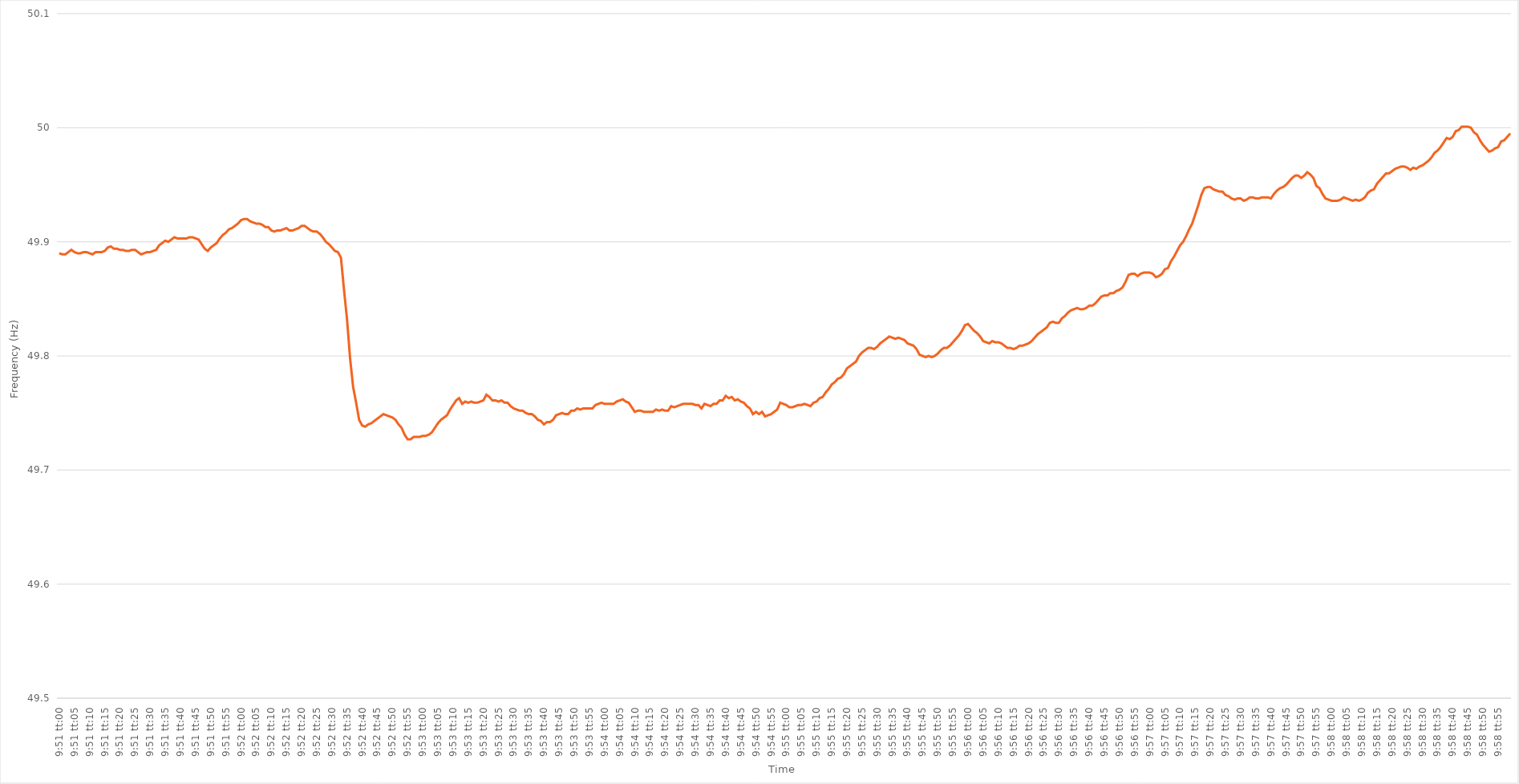
| Category | Series 0 |
|---|---|
| 0.41041666666666665 | 49.89 |
| 0.41042824074074075 | 49.889 |
| 0.4104398148148148 | 49.889 |
| 0.41045138888888894 | 49.891 |
| 0.410462962962963 | 49.893 |
| 0.41047453703703707 | 49.891 |
| 0.4104861111111111 | 49.89 |
| 0.4104976851851852 | 49.89 |
| 0.41050925925925924 | 49.891 |
| 0.4105208333333333 | 49.891 |
| 0.41053240740740743 | 49.89 |
| 0.41054398148148147 | 49.889 |
| 0.41055555555555556 | 49.891 |
| 0.4105671296296296 | 49.891 |
| 0.4105787037037037 | 49.891 |
| 0.41059027777777773 | 49.892 |
| 0.4106018518518519 | 49.895 |
| 0.4106134259259259 | 49.896 |
| 0.410625 | 49.894 |
| 0.41063657407407406 | 49.894 |
| 0.41064814814814815 | 49.893 |
| 0.4106597222222222 | 49.893 |
| 0.41067129629629634 | 49.892 |
| 0.4106828703703704 | 49.892 |
| 0.4106944444444445 | 49.893 |
| 0.4107060185185185 | 49.893 |
| 0.4107175925925926 | 49.891 |
| 0.41072916666666665 | 49.889 |
| 0.4107407407407408 | 49.89 |
| 0.41075231481481483 | 49.891 |
| 0.4107638888888889 | 49.891 |
| 0.41077546296296297 | 49.892 |
| 0.410787037037037 | 49.893 |
| 0.4107986111111111 | 49.897 |
| 0.41081018518518514 | 49.899 |
| 0.4108217592592593 | 49.901 |
| 0.41083333333333333 | 49.9 |
| 0.4108449074074074 | 49.902 |
| 0.41085648148148146 | 49.904 |
| 0.41086805555555556 | 49.903 |
| 0.4108796296296296 | 49.903 |
| 0.41089120370370374 | 49.903 |
| 0.4109027777777778 | 49.903 |
| 0.4109143518518519 | 49.904 |
| 0.4109259259259259 | 49.904 |
| 0.4109375 | 49.903 |
| 0.41094907407407405 | 49.902 |
| 0.4109606481481482 | 49.898 |
| 0.41097222222222224 | 49.894 |
| 0.41098379629629633 | 49.892 |
| 0.41099537037037037 | 49.895 |
| 0.4110069444444444 | 49.897 |
| 0.4110185185185185 | 49.899 |
| 0.41103009259259254 | 49.903 |
| 0.4110416666666667 | 49.906 |
| 0.41105324074074073 | 49.908 |
| 0.4110648148148148 | 49.911 |
| 0.41107638888888887 | 49.912 |
| 0.41108796296296296 | 49.914 |
| 0.411099537037037 | 49.916 |
| 0.41111111111111115 | 49.919 |
| 0.4111226851851852 | 49.92 |
| 0.4111342592592593 | 49.92 |
| 0.4111458333333333 | 49.918 |
| 0.4111574074074074 | 49.917 |
| 0.41116898148148145 | 49.916 |
| 0.4111805555555556 | 49.916 |
| 0.41119212962962964 | 49.915 |
| 0.41120370370370374 | 49.913 |
| 0.4112152777777778 | 49.913 |
| 0.4112268518518518 | 49.91 |
| 0.4112384259259259 | 49.909 |
| 0.41124999999999995 | 49.91 |
| 0.4112615740740741 | 49.91 |
| 0.41127314814814814 | 49.911 |
| 0.41128472222222223 | 49.912 |
| 0.41129629629629627 | 49.91 |
| 0.41130787037037037 | 49.91 |
| 0.4113194444444444 | 49.911 |
| 0.41133101851851855 | 49.912 |
| 0.4113425925925926 | 49.914 |
| 0.4113541666666667 | 49.914 |
| 0.4113657407407407 | 49.912 |
| 0.4113773148148148 | 49.91 |
| 0.41138888888888886 | 49.909 |
| 0.411400462962963 | 49.909 |
| 0.41141203703703705 | 49.907 |
| 0.41142361111111114 | 49.904 |
| 0.4114351851851852 | 49.9 |
| 0.4114467592592593 | 49.898 |
| 0.4114583333333333 | 49.895 |
| 0.41146990740740735 | 49.892 |
| 0.4114814814814815 | 49.891 |
| 0.41149305555555554 | 49.886 |
| 0.41150462962962964 | 49.858 |
| 0.4115162037037037 | 49.832 |
| 0.41152777777777777 | 49.798 |
| 0.4115393518518518 | 49.773 |
| 0.41155092592592596 | 49.759 |
| 0.4115625 | 49.744 |
| 0.4115740740740741 | 49.739 |
| 0.41158564814814813 | 49.738 |
| 0.4115972222222222 | 49.74 |
| 0.41160879629629626 | 49.741 |
| 0.4116203703703704 | 49.743 |
| 0.41163194444444445 | 49.745 |
| 0.41164351851851855 | 49.747 |
| 0.4116550925925926 | 49.749 |
| 0.4116666666666667 | 49.748 |
| 0.4116782407407407 | 49.747 |
| 0.41168981481481487 | 49.746 |
| 0.4117013888888889 | 49.744 |
| 0.41171296296296295 | 49.74 |
| 0.41172453703703704 | 49.737 |
| 0.4117361111111111 | 49.731 |
| 0.4117476851851852 | 49.727 |
| 0.4117592592592592 | 49.727 |
| 0.41177083333333336 | 49.729 |
| 0.4117824074074074 | 49.729 |
| 0.4117939814814815 | 49.729 |
| 0.41180555555555554 | 49.73 |
| 0.41181712962962963 | 49.73 |
| 0.41182870370370367 | 49.731 |
| 0.4118402777777778 | 49.733 |
| 0.41185185185185186 | 49.737 |
| 0.41186342592592595 | 49.741 |
| 0.411875 | 49.744 |
| 0.4118865740740741 | 49.746 |
| 0.4118981481481481 | 49.748 |
| 0.4119097222222223 | 49.753 |
| 0.4119212962962963 | 49.757 |
| 0.41193287037037035 | 49.761 |
| 0.41194444444444445 | 49.763 |
| 0.4119560185185185 | 49.758 |
| 0.4119675925925926 | 49.76 |
| 0.4119791666666666 | 49.759 |
| 0.41199074074074077 | 49.76 |
| 0.4120023148148148 | 49.759 |
| 0.4120138888888889 | 49.759 |
| 0.41202546296296294 | 49.76 |
| 0.41203703703703703 | 49.761 |
| 0.4120486111111111 | 49.766 |
| 0.4120601851851852 | 49.764 |
| 0.41207175925925926 | 49.761 |
| 0.41208333333333336 | 49.761 |
| 0.4120949074074074 | 49.76 |
| 0.4121064814814815 | 49.761 |
| 0.41211805555555553 | 49.759 |
| 0.4121296296296297 | 49.759 |
| 0.4121412037037037 | 49.756 |
| 0.4121527777777778 | 49.754 |
| 0.41216435185185185 | 49.753 |
| 0.4121759259259259 | 49.752 |
| 0.4121875 | 49.752 |
| 0.412199074074074 | 49.75 |
| 0.4122106481481482 | 49.749 |
| 0.4122222222222222 | 49.749 |
| 0.4122337962962963 | 49.747 |
| 0.41224537037037035 | 49.744 |
| 0.41225694444444444 | 49.743 |
| 0.4122685185185185 | 49.74 |
| 0.41228009259259263 | 49.742 |
| 0.41229166666666667 | 49.742 |
| 0.41230324074074076 | 49.744 |
| 0.4123148148148148 | 49.748 |
| 0.4123263888888889 | 49.749 |
| 0.41233796296296293 | 49.75 |
| 0.4123495370370371 | 49.749 |
| 0.4123611111111111 | 49.749 |
| 0.4123726851851852 | 49.752 |
| 0.41238425925925926 | 49.752 |
| 0.41239583333333335 | 49.754 |
| 0.4124074074074074 | 49.753 |
| 0.41241898148148143 | 49.754 |
| 0.4124305555555556 | 49.754 |
| 0.4124421296296296 | 49.754 |
| 0.4124537037037037 | 49.754 |
| 0.41246527777777775 | 49.757 |
| 0.41247685185185184 | 49.758 |
| 0.4124884259259259 | 49.759 |
| 0.41250000000000003 | 49.758 |
| 0.41251157407407407 | 49.758 |
| 0.41252314814814817 | 49.758 |
| 0.4125347222222222 | 49.758 |
| 0.4125462962962963 | 49.76 |
| 0.41255787037037034 | 49.761 |
| 0.4125694444444445 | 49.762 |
| 0.4125810185185185 | 49.76 |
| 0.4125925925925926 | 49.759 |
| 0.41260416666666666 | 49.755 |
| 0.41261574074074076 | 49.751 |
| 0.4126273148148148 | 49.752 |
| 0.41263888888888894 | 49.752 |
| 0.412650462962963 | 49.751 |
| 0.412662037037037 | 49.751 |
| 0.4126736111111111 | 49.751 |
| 0.41268518518518515 | 49.751 |
| 0.41269675925925925 | 49.753 |
| 0.4127083333333333 | 49.752 |
| 0.41271990740740744 | 49.753 |
| 0.4127314814814815 | 49.752 |
| 0.41274305555555557 | 49.752 |
| 0.4127546296296296 | 49.756 |
| 0.4127662037037037 | 49.755 |
| 0.41277777777777774 | 49.756 |
| 0.4127893518518519 | 49.757 |
| 0.41280092592592593 | 49.758 |
| 0.4128125 | 49.758 |
| 0.41282407407407407 | 49.758 |
| 0.41283564814814816 | 49.758 |
| 0.4128472222222222 | 49.757 |
| 0.41285879629629635 | 49.757 |
| 0.4128703703703704 | 49.754 |
| 0.4128819444444444 | 49.758 |
| 0.4128935185185185 | 49.757 |
| 0.41290509259259256 | 49.756 |
| 0.41291666666666665 | 49.758 |
| 0.4129282407407407 | 49.758 |
| 0.41293981481481484 | 49.761 |
| 0.4129513888888889 | 49.761 |
| 0.412962962962963 | 49.765 |
| 0.412974537037037 | 49.763 |
| 0.4129861111111111 | 49.764 |
| 0.41299768518518515 | 49.761 |
| 0.4130092592592593 | 49.762 |
| 0.41302083333333334 | 49.76 |
| 0.41303240740740743 | 49.759 |
| 0.41304398148148147 | 49.756 |
| 0.41305555555555556 | 49.754 |
| 0.4130671296296296 | 49.749 |
| 0.41307870370370375 | 49.751 |
| 0.4130902777777778 | 49.749 |
| 0.4131018518518519 | 49.751 |
| 0.4131134259259259 | 49.747 |
| 0.41312499999999996 | 49.748 |
| 0.41313657407407406 | 49.749 |
| 0.4131481481481481 | 49.751 |
| 0.41315972222222225 | 49.753 |
| 0.4131712962962963 | 49.759 |
| 0.4131828703703704 | 49.758 |
| 0.4131944444444444 | 49.757 |
| 0.4132060185185185 | 49.755 |
| 0.41321759259259255 | 49.755 |
| 0.4132291666666667 | 49.756 |
| 0.41324074074074074 | 49.757 |
| 0.41325231481481484 | 49.757 |
| 0.4132638888888889 | 49.758 |
| 0.41327546296296297 | 49.757 |
| 0.413287037037037 | 49.756 |
| 0.41329861111111116 | 49.759 |
| 0.4133101851851852 | 49.76 |
| 0.4133217592592593 | 49.763 |
| 0.41333333333333333 | 49.764 |
| 0.4133449074074074 | 49.768 |
| 0.41335648148148146 | 49.771 |
| 0.4133680555555555 | 49.775 |
| 0.41337962962962965 | 49.777 |
| 0.4133912037037037 | 49.78 |
| 0.4134027777777778 | 49.781 |
| 0.4134143518518518 | 49.784 |
| 0.4134259259259259 | 49.789 |
| 0.41343749999999996 | 49.791 |
| 0.4134490740740741 | 49.793 |
| 0.41346064814814815 | 49.795 |
| 0.41347222222222224 | 49.8 |
| 0.4134837962962963 | 49.803 |
| 0.4134953703703704 | 49.805 |
| 0.4135069444444444 | 49.807 |
| 0.41351851851851856 | 49.807 |
| 0.4135300925925926 | 49.806 |
| 0.4135416666666667 | 49.808 |
| 0.41355324074074074 | 49.811 |
| 0.41356481481481483 | 49.813 |
| 0.41357638888888887 | 49.815 |
| 0.413587962962963 | 49.817 |
| 0.41359953703703706 | 49.816 |
| 0.4136111111111111 | 49.815 |
| 0.4136226851851852 | 49.816 |
| 0.41363425925925923 | 49.815 |
| 0.4136458333333333 | 49.814 |
| 0.41365740740740736 | 49.811 |
| 0.4136689814814815 | 49.81 |
| 0.41368055555555555 | 49.809 |
| 0.41369212962962965 | 49.806 |
| 0.4137037037037037 | 49.801 |
| 0.4137152777777778 | 49.8 |
| 0.4137268518518518 | 49.799 |
| 0.41373842592592597 | 49.8 |
| 0.41375 | 49.799 |
| 0.4137615740740741 | 49.8 |
| 0.41377314814814814 | 49.802 |
| 0.41378472222222223 | 49.805 |
| 0.4137962962962963 | 49.807 |
| 0.4138078703703704 | 49.807 |
| 0.41381944444444446 | 49.809 |
| 0.4138310185185185 | 49.812 |
| 0.4138425925925926 | 49.815 |
| 0.41385416666666663 | 49.818 |
| 0.41386574074074073 | 49.822 |
| 0.41387731481481477 | 49.827 |
| 0.4138888888888889 | 49.828 |
| 0.41390046296296296 | 49.825 |
| 0.41391203703703705 | 49.822 |
| 0.4139236111111111 | 49.82 |
| 0.4139351851851852 | 49.817 |
| 0.4139467592592592 | 49.813 |
| 0.4139583333333334 | 49.812 |
| 0.4139699074074074 | 49.811 |
| 0.4139814814814815 | 49.813 |
| 0.41399305555555554 | 49.812 |
| 0.41400462962962964 | 49.812 |
| 0.4140162037037037 | 49.811 |
| 0.41402777777777783 | 49.809 |
| 0.41403935185185187 | 49.807 |
| 0.41405092592592596 | 49.807 |
| 0.4140625 | 49.806 |
| 0.41407407407407404 | 49.807 |
| 0.41408564814814813 | 49.809 |
| 0.41409722222222217 | 49.809 |
| 0.4141087962962963 | 49.81 |
| 0.41412037037037036 | 49.811 |
| 0.41413194444444446 | 49.813 |
| 0.4141435185185185 | 49.816 |
| 0.4141550925925926 | 49.819 |
| 0.4141666666666666 | 49.821 |
| 0.4141782407407408 | 49.823 |
| 0.4141898148148148 | 49.825 |
| 0.4142013888888889 | 49.829 |
| 0.41421296296296295 | 49.83 |
| 0.41422453703703704 | 49.829 |
| 0.4142361111111111 | 49.829 |
| 0.41424768518518523 | 49.833 |
| 0.41425925925925927 | 49.835 |
| 0.41427083333333337 | 49.838 |
| 0.4142824074074074 | 49.84 |
| 0.4142939814814815 | 49.841 |
| 0.41430555555555554 | 49.842 |
| 0.4143171296296296 | 49.841 |
| 0.4143287037037037 | 49.841 |
| 0.41434027777777777 | 49.842 |
| 0.41435185185185186 | 49.844 |
| 0.4143634259259259 | 49.844 |
| 0.414375 | 49.846 |
| 0.41438657407407403 | 49.849 |
| 0.4143981481481482 | 49.852 |
| 0.4144097222222222 | 49.853 |
| 0.4144212962962963 | 49.853 |
| 0.41443287037037035 | 49.855 |
| 0.41444444444444445 | 49.855 |
| 0.4144560185185185 | 49.857 |
| 0.41446759259259264 | 49.858 |
| 0.4144791666666667 | 49.86 |
| 0.41449074074074077 | 49.865 |
| 0.4145023148148148 | 49.871 |
| 0.4145138888888889 | 49.872 |
| 0.41452546296296294 | 49.872 |
| 0.414537037037037 | 49.87 |
| 0.41454861111111113 | 49.872 |
| 0.41456018518518517 | 49.873 |
| 0.41457175925925926 | 49.873 |
| 0.4145833333333333 | 49.873 |
| 0.4145949074074074 | 49.872 |
| 0.41460648148148144 | 49.869 |
| 0.4146180555555556 | 49.87 |
| 0.4146296296296296 | 49.872 |
| 0.4146412037037037 | 49.876 |
| 0.41465277777777776 | 49.877 |
| 0.41466435185185185 | 49.883 |
| 0.4146759259259259 | 49.887 |
| 0.41468750000000004 | 49.892 |
| 0.4146990740740741 | 49.897 |
| 0.4147106481481482 | 49.9 |
| 0.4147222222222222 | 49.905 |
| 0.4147337962962963 | 49.911 |
| 0.41474537037037035 | 49.916 |
| 0.4147569444444445 | 49.924 |
| 0.41476851851851854 | 49.932 |
| 0.4147800925925926 | 49.941 |
| 0.41479166666666667 | 49.947 |
| 0.4148032407407407 | 49.948 |
| 0.4148148148148148 | 49.948 |
| 0.41482638888888884 | 49.946 |
| 0.414837962962963 | 49.945 |
| 0.41484953703703703 | 49.944 |
| 0.4148611111111111 | 49.944 |
| 0.41487268518518516 | 49.941 |
| 0.41488425925925926 | 49.94 |
| 0.4148958333333333 | 49.938 |
| 0.41490740740740745 | 49.937 |
| 0.4149189814814815 | 49.938 |
| 0.4149305555555556 | 49.938 |
| 0.4149421296296296 | 49.936 |
| 0.4149537037037037 | 49.937 |
| 0.41496527777777775 | 49.939 |
| 0.4149768518518519 | 49.939 |
| 0.41498842592592594 | 49.938 |
| 0.41500000000000004 | 49.938 |
| 0.4150115740740741 | 49.939 |
| 0.4150231481481481 | 49.939 |
| 0.4150347222222222 | 49.939 |
| 0.41504629629629625 | 49.938 |
| 0.4150578703703704 | 49.942 |
| 0.41506944444444444 | 49.945 |
| 0.41508101851851853 | 49.947 |
| 0.41509259259259257 | 49.948 |
| 0.41510416666666666 | 49.95 |
| 0.4151157407407407 | 49.953 |
| 0.41512731481481485 | 49.956 |
| 0.4151388888888889 | 49.958 |
| 0.415150462962963 | 49.958 |
| 0.415162037037037 | 49.956 |
| 0.4151736111111111 | 49.958 |
| 0.41518518518518516 | 49.961 |
| 0.4151967592592593 | 49.959 |
| 0.41520833333333335 | 49.956 |
| 0.41521990740740744 | 49.949 |
| 0.4152314814814815 | 49.947 |
| 0.4152430555555556 | 49.942 |
| 0.4152546296296296 | 49.938 |
| 0.41526620370370365 | 49.937 |
| 0.4152777777777778 | 49.936 |
| 0.41528935185185184 | 49.936 |
| 0.41530092592592593 | 49.936 |
| 0.4153125 | 49.937 |
| 0.41532407407407407 | 49.939 |
| 0.4153356481481481 | 49.938 |
| 0.41534722222222226 | 49.937 |
| 0.4153587962962963 | 49.936 |
| 0.4153703703703704 | 49.937 |
| 0.41538194444444443 | 49.936 |
| 0.4153935185185185 | 49.937 |
| 0.41540509259259256 | 49.939 |
| 0.4154166666666667 | 49.943 |
| 0.41542824074074075 | 49.945 |
| 0.41543981481481485 | 49.946 |
| 0.4154513888888889 | 49.951 |
| 0.415462962962963 | 49.954 |
| 0.415474537037037 | 49.957 |
| 0.41548611111111106 | 49.96 |
| 0.4154976851851852 | 49.96 |
| 0.41550925925925924 | 49.962 |
| 0.41552083333333334 | 49.964 |
| 0.4155324074074074 | 49.965 |
| 0.4155439814814815 | 49.966 |
| 0.4155555555555555 | 49.966 |
| 0.41556712962962966 | 49.965 |
| 0.4155787037037037 | 49.963 |
| 0.4155902777777778 | 49.965 |
| 0.41560185185185183 | 49.964 |
| 0.41561342592592593 | 49.966 |
| 0.41562499999999997 | 49.967 |
| 0.4156365740740741 | 49.969 |
| 0.41564814814814816 | 49.971 |
| 0.41565972222222225 | 49.974 |
| 0.4156712962962963 | 49.978 |
| 0.4156828703703704 | 49.98 |
| 0.4156944444444444 | 49.983 |
| 0.41570601851851857 | 49.987 |
| 0.4157175925925926 | 49.991 |
| 0.41572916666666665 | 49.99 |
| 0.41574074074074074 | 49.992 |
| 0.4157523148148148 | 49.997 |
| 0.4157638888888889 | 49.998 |
| 0.4157754629629629 | 50.001 |
| 0.41578703703703707 | 50.001 |
| 0.4157986111111111 | 50.001 |
| 0.4158101851851852 | 50 |
| 0.41582175925925924 | 49.996 |
| 0.41583333333333333 | 49.994 |
| 0.41584490740740737 | 49.989 |
| 0.4158564814814815 | 49.985 |
| 0.41586805555555556 | 49.982 |
| 0.41587962962962965 | 49.979 |
| 0.4158912037037037 | 49.98 |
| 0.4159027777777778 | 49.982 |
| 0.4159143518518518 | 49.983 |
| 0.415925925925926 | 49.988 |
| 0.4159375 | 49.989 |
| 0.4159490740740741 | 49.992 |
| 0.41596064814814815 | 49.995 |